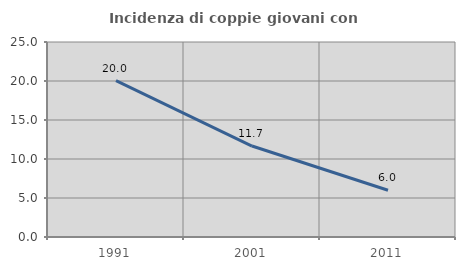
| Category | Incidenza di coppie giovani con figli |
|---|---|
| 1991.0 | 20.04 |
| 2001.0 | 11.663 |
| 2011.0 | 5.995 |